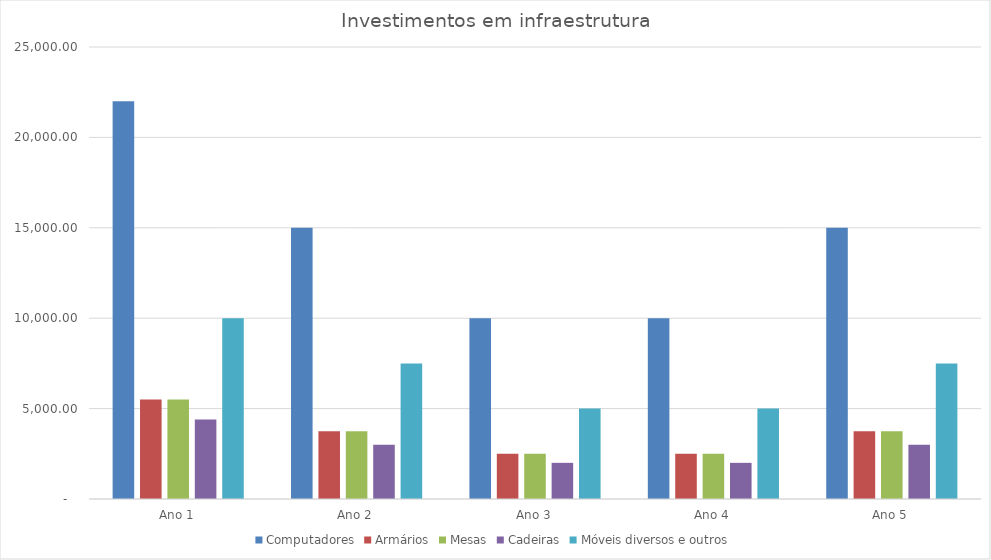
| Category | Computadores | Armários | Mesas | Cadeiras | Móveis diversos e outros |
|---|---|---|---|---|---|
| Ano 1 | 22000 | 5500 | 5500 | 4400 | 10000 |
| Ano 2 | 15000 | 3750 | 3750 | 3000 | 7500 |
| Ano 3 | 10000 | 2500 | 2500 | 2000 | 5000 |
| Ano 4 | 10000 | 2500 | 2500 | 2000 | 5000 |
| Ano 5 | 15000 | 3750 | 3750 | 3000 | 7500 |